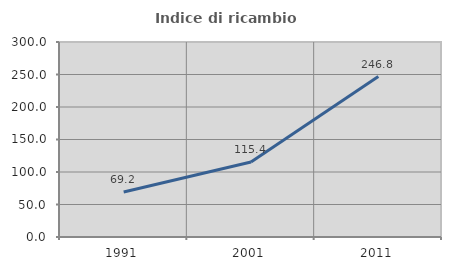
| Category | Indice di ricambio occupazionale  |
|---|---|
| 1991.0 | 69.179 |
| 2001.0 | 115.412 |
| 2011.0 | 246.847 |